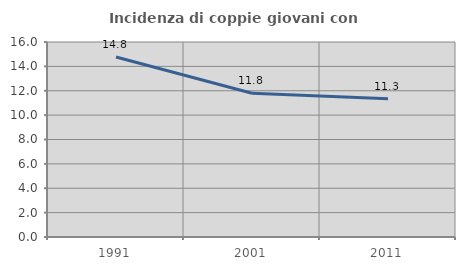
| Category | Incidenza di coppie giovani con figli |
|---|---|
| 1991.0 | 14.771 |
| 2001.0 | 11.794 |
| 2011.0 | 11.337 |